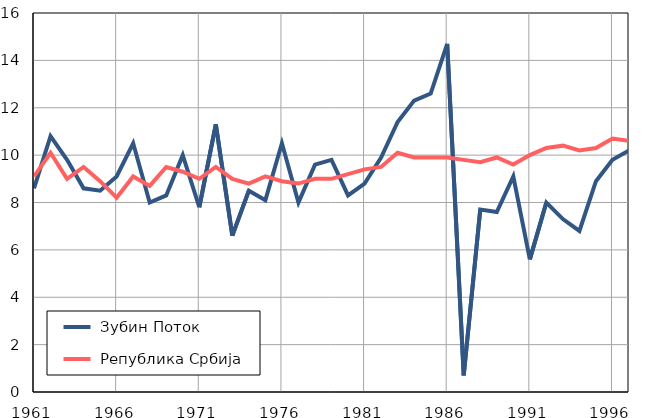
| Category |  Зубин Поток |  Република Србија |
|---|---|---|
| 1961.0 | 8.6 | 9.1 |
| 1962.0 | 10.8 | 10.1 |
| 1963.0 | 9.8 | 9 |
| 1964.0 | 8.6 | 9.5 |
| 1965.0 | 8.5 | 8.9 |
| 1966.0 | 9.1 | 8.2 |
| 1967.0 | 10.5 | 9.1 |
| 1968.0 | 8 | 8.7 |
| 1969.0 | 8.3 | 9.5 |
| 1970.0 | 10 | 9.3 |
| 1971.0 | 7.8 | 9 |
| 1972.0 | 11.3 | 9.5 |
| 1973.0 | 6.6 | 9 |
| 1974.0 | 8.5 | 8.8 |
| 1975.0 | 8.1 | 9.1 |
| 1976.0 | 10.5 | 8.9 |
| 1977.0 | 8 | 8.8 |
| 1978.0 | 9.6 | 9 |
| 1979.0 | 9.8 | 9 |
| 1980.0 | 8.3 | 9.2 |
| 1981.0 | 8.8 | 9.4 |
| 1982.0 | 9.9 | 9.5 |
| 1983.0 | 11.4 | 10.1 |
| 1984.0 | 12.3 | 9.9 |
| 1985.0 | 12.6 | 9.9 |
| 1986.0 | 14.7 | 9.9 |
| 1987.0 | 0.7 | 9.8 |
| 1988.0 | 7.7 | 9.7 |
| 1989.0 | 7.6 | 9.9 |
| 1990.0 | 9.1 | 9.6 |
| 1991.0 | 5.6 | 10 |
| 1992.0 | 8 | 10.3 |
| 1993.0 | 7.3 | 10.4 |
| 1994.0 | 6.8 | 10.2 |
| 1995.0 | 8.9 | 10.3 |
| 1996.0 | 9.8 | 10.7 |
| 1997.0 | 10.2 | 10.6 |